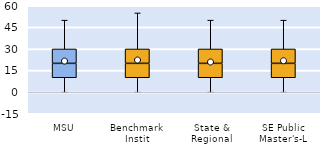
| Category | 25th | 50th | 75th |
|---|---|---|---|
| MSU | 10 | 10 | 10 |
| Benchmark Instit | 10 | 10 | 10 |
| State & Regional | 10 | 10 | 10 |
| SE Public Master's-L | 10 | 10 | 10 |